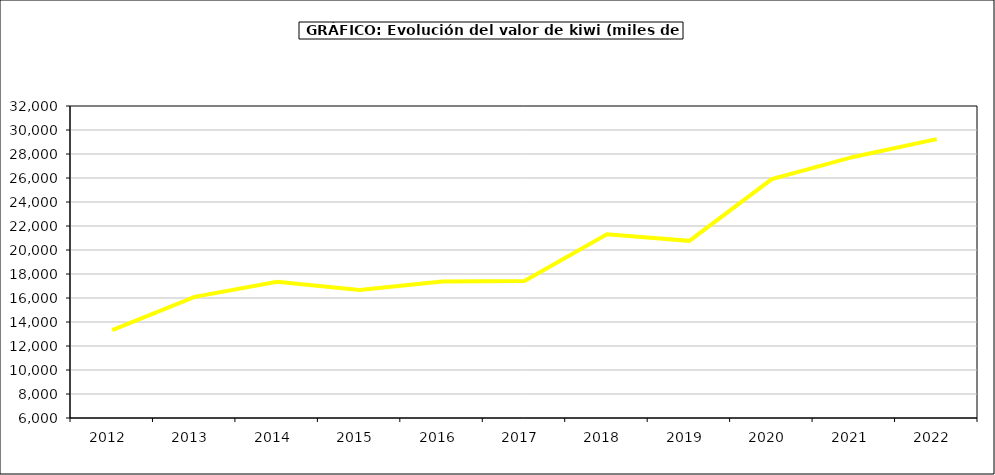
| Category | valor kiwi |
|---|---|
| 2012.0 | 13318.873 |
| 2013.0 | 16091.324 |
| 2014.0 | 17344.225 |
| 2015.0 | 16673 |
| 2016.0 | 17366 |
| 2017.0 | 17410.786 |
| 2018.0 | 21304.319 |
| 2019.0 | 20763.178 |
| 2020.0 | 25913.973 |
| 2021.0 | 27777.188 |
| 2022.0 | 29243.061 |